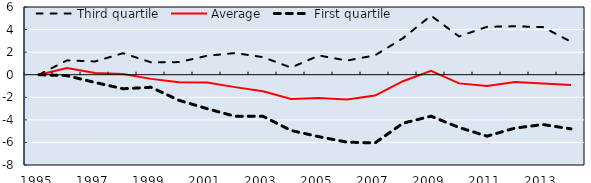
| Category | Third quartile | Average | First quartile |
|---|---|---|---|
| 1995.0 | 0 | 0 | 0 |
| 1996.0 | 1.273 | 0.589 | -0.083 |
| 1997.0 | 1.174 | 0.159 | -0.688 |
| 1998.0 | 1.905 | 0.072 | -1.242 |
| 1999.0 | 1.1 | -0.369 | -1.112 |
| 2000.0 | 1.117 | -0.657 | -2.268 |
| 2001.0 | 1.676 | -0.687 | -3.006 |
| 2002.0 | 1.92 | -1.099 | -3.685 |
| 2003.0 | 1.558 | -1.47 | -3.679 |
| 2004.0 | 0.631 | -2.156 | -4.941 |
| 2005.0 | 1.702 | -2.062 | -5.493 |
| 2006.0 | 1.255 | -2.191 | -5.976 |
| 2007.0 | 1.716 | -1.844 | -6.045 |
| 2008.0 | 3.235 | -0.576 | -4.295 |
| 2009.0 | 5.234 | 0.345 | -3.674 |
| 2010.0 | 3.392 | -0.767 | -4.672 |
| 2011.0 | 4.246 | -0.99 | -5.446 |
| 2012.0 | 4.29 | -0.652 | -4.729 |
| 2013.0 | 4.216 | -0.777 | -4.417 |
| 2014.0 | 2.921 | -0.904 | -4.799 |